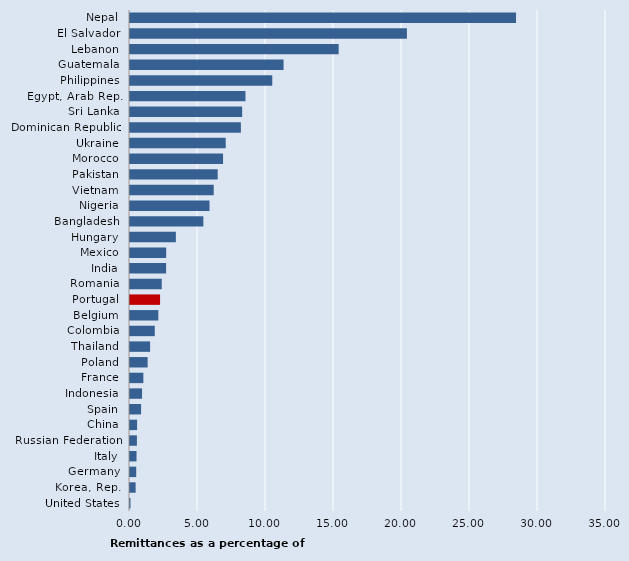
| Category | Series 0 |
|---|---|
| Nepal | 28.386 |
| El Salvador | 20.361 |
| Lebanon | 15.343 |
| Guatemala | 11.293 |
| Philippines | 10.462 |
| Egypt, Arab Rep. | 8.49 |
| Sri Lanka | 8.248 |
| Dominican Republic | 8.153 |
| Ukraine | 7.039 |
| Morocco | 6.842 |
| Pakistan | 6.448 |
| Vietnam | 6.156 |
| Nigeria | 5.846 |
| Bangladesh | 5.394 |
| Hungary | 3.372 |
| Mexico | 2.661 |
| India | 2.655 |
| Romania | 2.334 |
| Portugal | 2.211 |
| Belgium | 2.085 |
| Colombia | 1.823 |
| Thailand | 1.478 |
| Poland | 1.297 |
| France | 0.982 |
| Indonesia | 0.886 |
| Spain | 0.815 |
| China | 0.522 |
| Russian Federation | 0.509 |
| Italy | 0.48 |
| Germany | 0.458 |
| Korea, Rep. | 0.414 |
| United States | 0.034 |